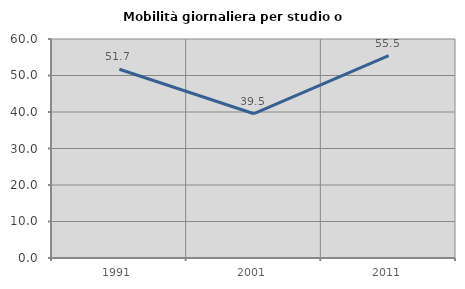
| Category | Mobilità giornaliera per studio o lavoro |
|---|---|
| 1991.0 | 51.701 |
| 2001.0 | 39.526 |
| 2011.0 | 55.459 |